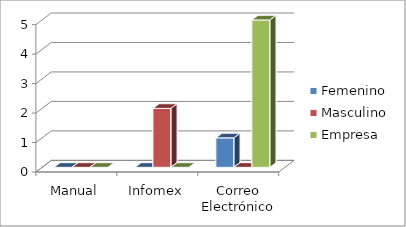
| Category | Femenino | Masculino | Empresa |
|---|---|---|---|
| 0 | 0 | 0 | 0 |
| 1 | 0 | 2 | 0 |
| 2 | 1 | 0 | 5 |